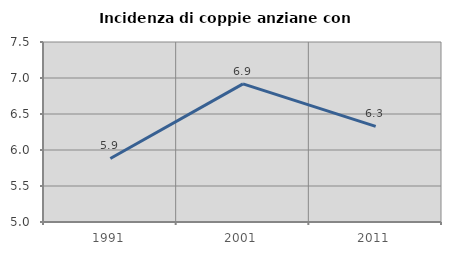
| Category | Incidenza di coppie anziane con figli |
|---|---|
| 1991.0 | 5.882 |
| 2001.0 | 6.918 |
| 2011.0 | 6.329 |